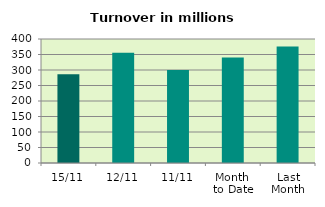
| Category | Series 0 |
|---|---|
| 15/11 | 286.593 |
| 12/11 | 355.969 |
| 11/11 | 299.614 |
| Month 
to Date | 340.302 |
| Last
Month | 375.959 |